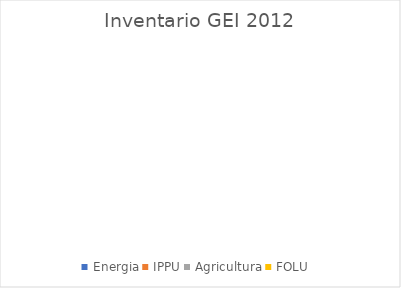
| Category | Series 0 |
|---|---|
| Energia | 0 |
| IPPU | 0 |
| Agricultura | 0 |
| FOLU | 0 |